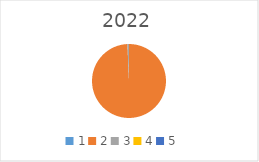
| Category | Series 0 |
|---|---|
| 1.0 | 0 |
| 2.0 | 2921300.84 |
| 3.0 | 20355.19 |
| 4.0 | 0 |
| 5.0 | 0 |